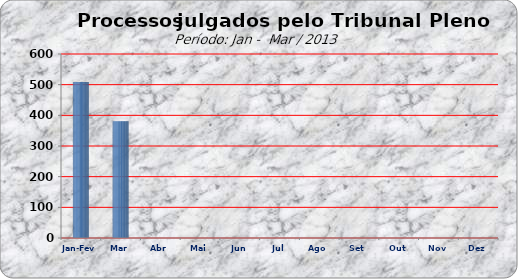
| Category | Series 0 |
|---|---|
| Jan-Fev | 509 |
| Mar | 381 |
| Abr | 0 |
| Mai | 0 |
| Jun | 0 |
| Jul | 0 |
| Ago | 0 |
| Set | 0 |
| Out | 0 |
| Nov | 0 |
| Dez | 0 |